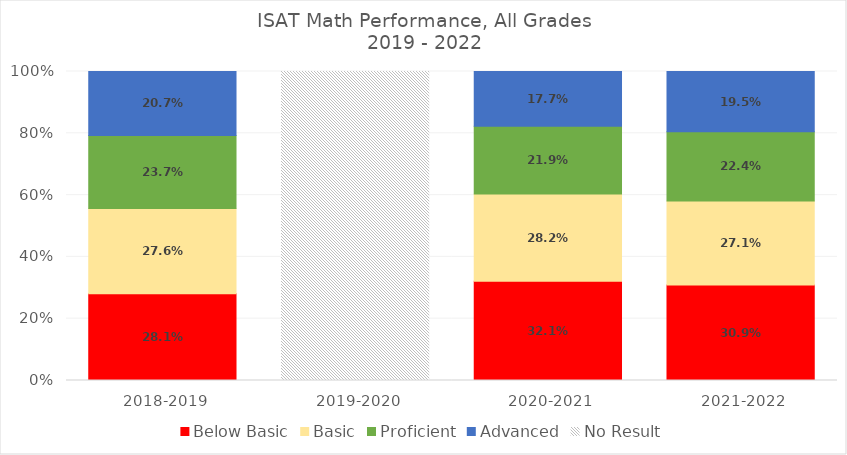
| Category | Below Basic | Basic | Proficient | Advanced | No Result |
|---|---|---|---|---|---|
| 2018-2019
 | 0.281 | 0.276 | 0.237 | 0.207 | 0 |
| 2019-2020
 | 0 | 0 | 0 | 0 | 1 |
| 2020-2021
 | 0.321 | 0.282 | 0.219 | 0.177 | 0 |
| 2021-2022
 | 0.309 | 0.271 | 0.224 | 0.195 | 0 |